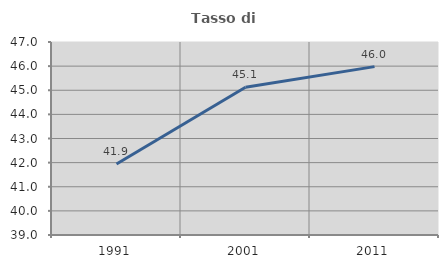
| Category | Tasso di occupazione   |
|---|---|
| 1991.0 | 41.943 |
| 2001.0 | 45.126 |
| 2011.0 | 45.979 |